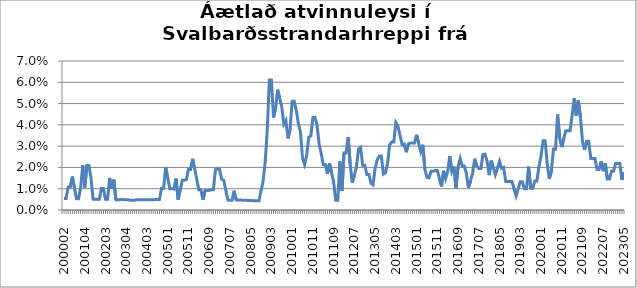
| Category | Series 0 |
|---|---|
| 200002 | 0.005 |
| 200003 | 0.005 |
| 200005 | 0.011 |
| 200006 | 0.011 |
| 200007 | 0.016 |
| 200008 | 0.01 |
| 200012 | 0.005 |
| 200101 | 0.005 |
| 200102 | 0.01 |
| 200103 | 0.021 |
| 200104 | 0.01 |
| 200105 | 0.021 |
| 200106 | 0.021 |
| 200107 | 0.015 |
| 200108 | 0.005 |
| 200109 | 0.005 |
| 200111 | 0.005 |
| 200112 | 0.005 |
| 200201 | 0.01 |
| 200202 | 0.01 |
| 200203 | 0.005 |
| 200204 | 0.005 |
| 200205 | 0.015 |
| 200206 | 0.01 |
| 200207 | 0.014 |
| 200209 | 0.005 |
| 200210 | 0.005 |
| 200301 | 0.005 |
| 200302 | 0.005 |
| 200303 | 0.005 |
| 200304 | 0.005 |
| 200305 | 0.005 |
| 200307 | 0.005 |
| 200308 | 0.005 |
| 200309 | 0.005 |
| 200310 | 0.005 |
| 200311 | 0.005 |
| 200312 | 0.005 |
| 200401 | 0.005 |
| 200402 | 0.005 |
| 200403 | 0.005 |
| 200404 | 0.005 |
| 200405 | 0.005 |
| 200406 | 0.005 |
| 200407 | 0.005 |
| 200408 | 0.005 |
| 200409 | 0.005 |
| 200410 | 0.01 |
| 200411 | 0.01 |
| 200412 | 0.02 |
| 200501 | 0.015 |
| 200502 | 0.01 |
| 200503 | 0.01 |
| 200504 | 0.01 |
| 200505 | 0.015 |
| 200506 | 0.005 |
| 200507 | 0.009 |
| 200508 | 0.014 |
| 200509 | 0.014 |
| 200510 | 0.014 |
| 200511 | 0.019 |
| 200512 | 0.019 |
| 200601 | 0.024 |
| 200602 | 0.019 |
| 200603 | 0.014 |
| 200604 | 0.009 |
| 200605 | 0.009 |
| 200606 | 0.005 |
| 200607 | 0.009 |
| 200608 | 0.009 |
| 200609 | 0.009 |
| 200610 | 0.009 |
| 200611 | 0.009 |
| 200612 | 0.019 |
| 200701 | 0.019 |
| 200702 | 0.019 |
| 200703 | 0.014 |
| 200704 | 0.014 |
| 200705 | 0.009 |
| 200706 | 0.005 |
| 200707 | 0.005 |
| 200708 | 0.005 |
| 200709 | 0.009 |
| 200710 | 0.005 |
| 200711 | 0.005 |
| 200712 | 0.005 |
| 200801 | 0.005 |
| 200802 | 0.005 |
| 200803 | 0.005 |
| 200804 | 0.004 |
| 200805 | 0.004 |
| 200806 | 0.004 |
| 200807 | 0.004 |
| 200808 | 0.004 |
| 200809 | 0.004 |
| 200810 | 0.009 |
| 200811 | 0.014 |
| 200812 | 0.023 |
| 200901 | 0.038 |
| 200902 | 0.061 |
| 200903 | 0.061 |
| 200904 | 0.043 |
| 200905 | 0.048 |
| 200906 | 0.057 |
| 200907 | 0.052 |
| 200908 | 0.048 |
| 200909 | 0.04 |
| 200910 | 0.042 |
| 200911 | 0.034 |
| 200912 | 0.038 |
| 201001 | 0.051 |
| 201002 | 0.051 |
| 201003 | 0.047 |
| 201004 | 0.041 |
| 201005 | 0.037 |
| 201006 | 0.024 |
| 201007 | 0.021 |
| 201008 | 0.026 |
| 201009 | 0.034 |
| 201010 | 0.035 |
| 201011 | 0.043 |
| 201012 | 0.043 |
| 201101 | 0.04 |
| 201102 | 0.031 |
| 201103 | 0.027 |
| 201104 | 0.021 |
| 201105 | 0.021 |
| 201106 | 0.017 |
| 201107 | 0.022 |
| 201108 | 0.018 |
| 201109 | 0.013 |
| 201110 | 0.005 |
| 201111 | 0.005 |
| 201112 | 0.023 |
| 201201 | 0.009 |
| 201202 | 0.027 |
| 201203 | 0.027 |
| 201204 | 0.034 |
| 201205 | 0.021 |
| 201206 | 0.013 |
| 201207 | 0.016 |
| 201208 | 0.02 |
| 201209 | 0.029 |
| 201210 | 0.029 |
| 201211 | 0.021 |
| 201212 | 0.021 |
| 201301 | 0.017 |
| 201302 | 0.017 |
| 201303 | 0.013 |
| 201304 | 0.012 |
| 201305 | 0.02 |
| 201306 | 0.024 |
| 201307 | 0.025 |
| 201308 | 0.025 |
| 201309 | 0.017 |
| 201310 | 0.017 |
| 201311 | 0.022 |
| 201312 | 0.031 |
| 201401 | 0.032 |
| 201402 | 0.032 |
| 201403 | 0.041 |
| 201404 | 0.039 |
| 201405 | 0.035 |
| 201406 | 0.031 |
| 201407 | 0.031 |
| 201408 | 0.027 |
| 201409 | 0.031 |
| 201410 | 0.031 |
| 201411 | 0.031 |
| 201412 | 0.031 |
| 201501 | 0.035 |
| 201502 | 0.031 |
| 201503 | 0.027 |
| 201504 | 0.031 |
| 201505 | 0.019 |
| 201506 | 0.015 |
| 201507 | 0.015 |
| 201508 | 0.018 |
| 201509 | 0.018 |
| 201510 | 0.019 |
| 201511 | 0.019 |
| 201512 | 0.015 |
| 201601 | 0.011 |
| 201602 | 0.018 |
| 201603 | 0.015 |
| 201604 | 0.018 |
| 201605 | 0.025 |
| 201606 | 0.018 |
| 201607 | 0.02 |
| 201608 | 0.01 |
| 201609 | 0.02 |
| 201610 | 0.024 |
| 201611 | 0.021 |
| 201612 | 0.021 |
| 201701 | 0.017 |
| 201702 | 0.01 |
| 201703 | 0.014 |
| 201704 | 0.017 |
| 201705 | 0.024 |
| 201706 | 0.021 |
| 201707 | 0.02 |
| 201708 | 0.02 |
| 201709 | 0.026 |
| 201710 | 0.026 |
| 201711 | 0.023 |
| 201712 | 0.016 |
| 201801 | 0.023 |
| 201802 | 0.02 |
| 201803 | 0.017 |
| 201804 | 0.02 |
| 201805 | 0.023 |
| 201806 | 0.02 |
| 201807 | 0.02 |
| 201808 | 0.013 |
| 201809 | 0.013 |
| 201810 | 0.013 |
| 201811 | 0.013 |
| 201812 | 0.01 |
| 201901 | 0.007 |
| 201902 | 0.01 |
| 201903 | 0.013 |
| 201904 | 0.013 |
| 201905 | 0.01 |
| 201906 | 0.01 |
| 201907 | 0.02 |
| 201908 | 0.01 |
| 201909 | 0.01 |
| 201910 | 0.014 |
| 201911 | 0.014 |
| 201912 | 0.02 |
| 202001 | 0.025 |
| 202002 | 0.032 |
| 202003 | 0.032 |
| 202004 | 0.022 |
| 202005 | 0.015 |
| 202006 | 0.018 |
| 202007 | 0.029 |
| 202008 | 0.029 |
| 202009 | 0.045 |
| 202010 | 0.034 |
| 202011 | 0.03 |
| 202012 | 0.034 |
| 202101 | 0.037 |
| 202102 | 0.037 |
| 202103 | 0.037 |
| 202104 | 0.044 |
| 202105 | 0.052 |
| 202106 | 0.044 |
| 202107 | 0.052 |
| 202108 | 0.044 |
| 202109 | 0.032 |
| 202110 | 0.028 |
| 202111 | 0.032 |
| 202112 | 0.032 |
| 202201 | 0.024 |
| 202202 | 0.024 |
| 202203 | 0.024 |
| 202204 | 0.019 |
| 202205 | 0.019 |
| 202206 | 0.023 |
| 202207 | 0.018 |
| 202208 | 0.022 |
| 202209 | 0.015 |
| 202210 | 0.015 |
| 202211 | 0.018 |
| 202212 | 0.018 |
| 202301 | 0.022 |
| 202302 | 0.022 |
| 202303 | 0.022 |
| 202304 | 0.014 |
| 202305 | 0.018 |